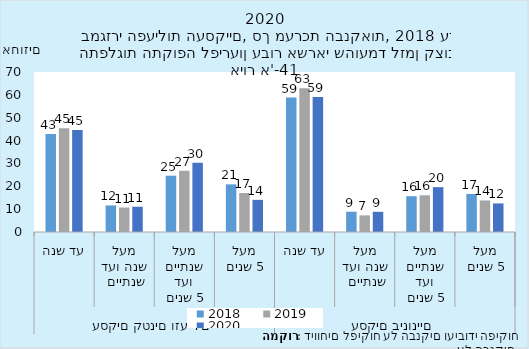
| Category | 2018 | 2019 | 2020 |
|---|---|---|---|
| 0 | 42.903 | 45.429 | 44.594 |
| 1 | 11.615 | 10.703 | 11.048 |
| 2 | 24.634 | 26.792 | 30.294 |
| 3 | 20.848 | 17.075 | 14.064 |
| 4 | 58.809 | 62.866 | 59.06 |
| 5 | 8.87 | 7.281 | 8.827 |
| 6 | 15.666 | 16.056 | 19.614 |
| 7 | 16.655 | 13.798 | 12.498 |